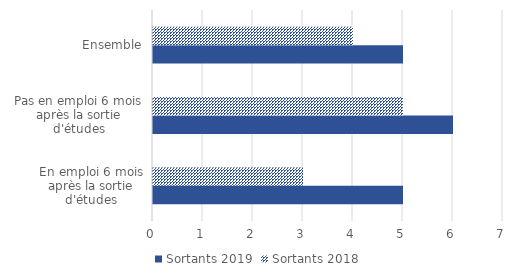
| Category | Sortants 2019 | Sortants 2018 |
|---|---|---|
| En emploi 6 mois après la sortie d'études | 5 | 3 |
| Pas en emploi 6 mois après la sortie d'études | 6 | 5 |
| Ensemble | 5 | 4 |